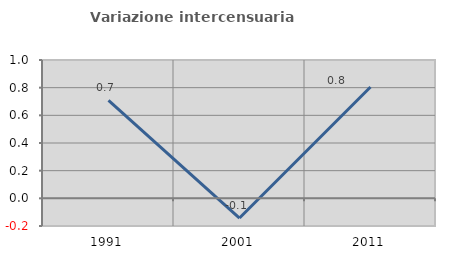
| Category | Variazione intercensuaria annua |
|---|---|
| 1991.0 | 0.708 |
| 2001.0 | -0.143 |
| 2011.0 | 0.805 |